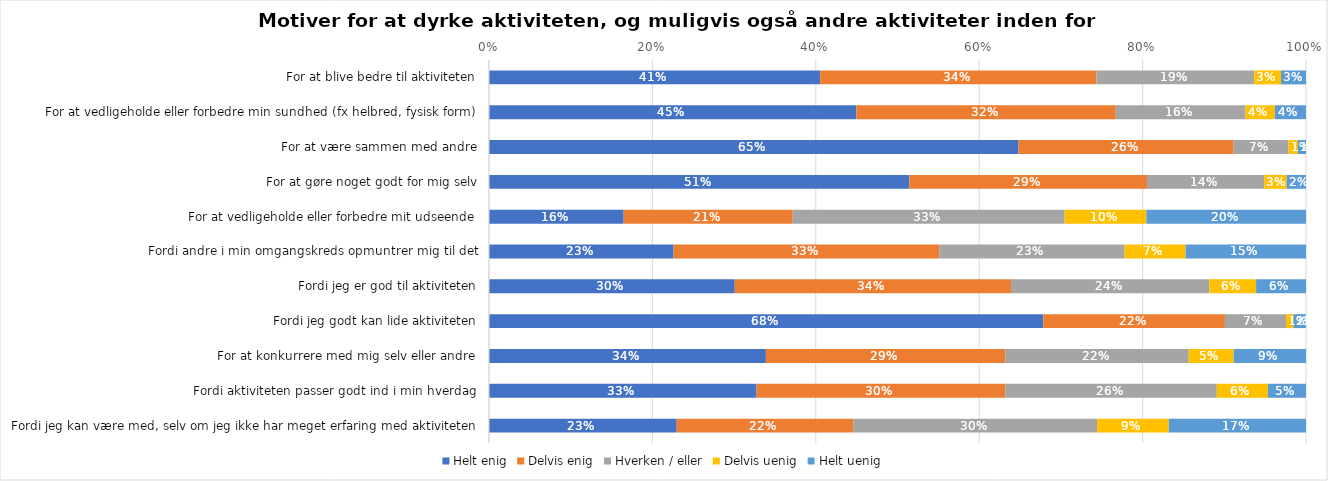
| Category | Helt enig | Delvis enig | Hverken / eller | Delvis uenig | Helt uenig |
|---|---|---|---|---|---|
| For at blive bedre til aktiviteten | 0.405 | 0.338 | 0.193 | 0.033 | 0.031 |
| For at vedligeholde eller forbedre min sundhed (fx helbred, fysisk form) | 0.45 | 0.318 | 0.159 | 0.036 | 0.038 |
| For at være sammen med andre | 0.648 | 0.263 | 0.067 | 0.011 | 0.01 |
| For at gøre noget godt for mig selv | 0.515 | 0.291 | 0.144 | 0.027 | 0.024 |
| For at vedligeholde eller forbedre mit udseende | 0.165 | 0.207 | 0.333 | 0.1 | 0.195 |
| Fordi andre i min omgangskreds opmuntrer mig til det | 0.226 | 0.325 | 0.227 | 0.075 | 0.147 |
| Fordi jeg er god til aktiviteten | 0.301 | 0.338 | 0.243 | 0.057 | 0.061 |
| Fordi jeg godt kan lide aktiviteten | 0.679 | 0.222 | 0.075 | 0.009 | 0.015 |
| For at konkurrere med mig selv eller andre | 0.339 | 0.293 | 0.224 | 0.055 | 0.089 |
| Fordi aktiviteten passer godt ind i min hverdag | 0.327 | 0.305 | 0.259 | 0.063 | 0.047 |
| Fordi jeg kan være med, selv om jeg ikke har meget erfaring med aktiviteten | 0.23 | 0.216 | 0.298 | 0.088 | 0.168 |